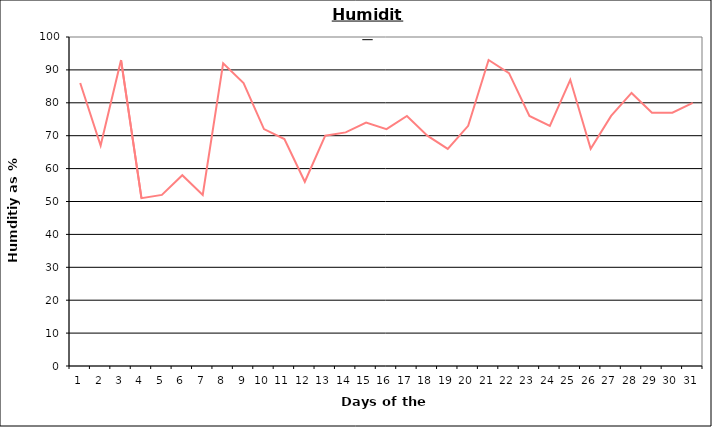
| Category | Series 0 |
|---|---|
| 0 | 86 |
| 1 | 67 |
| 2 | 93 |
| 3 | 51 |
| 4 | 52 |
| 5 | 58 |
| 6 | 52 |
| 7 | 92 |
| 8 | 86 |
| 9 | 72 |
| 10 | 69 |
| 11 | 56 |
| 12 | 70 |
| 13 | 71 |
| 14 | 74 |
| 15 | 72 |
| 16 | 76 |
| 17 | 70 |
| 18 | 66 |
| 19 | 73 |
| 20 | 93 |
| 21 | 89 |
| 22 | 76 |
| 23 | 73 |
| 24 | 87 |
| 25 | 66 |
| 26 | 76 |
| 27 | 83 |
| 28 | 77 |
| 29 | 77 |
| 30 | 80 |